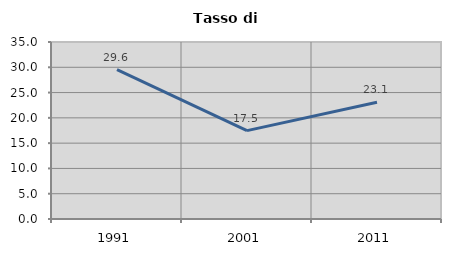
| Category | Tasso di disoccupazione   |
|---|---|
| 1991.0 | 29.554 |
| 2001.0 | 17.481 |
| 2011.0 | 23.074 |